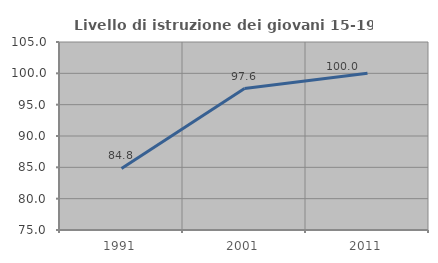
| Category | Livello di istruzione dei giovani 15-19 anni |
|---|---|
| 1991.0 | 84.831 |
| 2001.0 | 97.571 |
| 2011.0 | 100 |